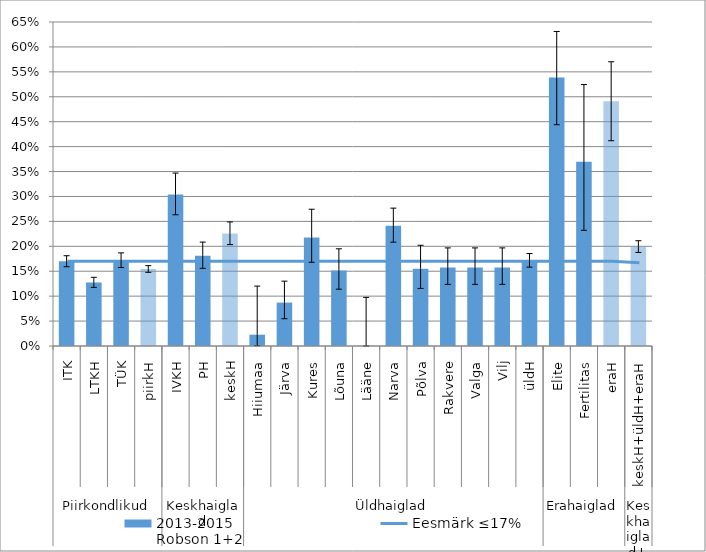
| Category | 2013-2015
Robson 1+2 |
|---|---|
| 0 | 0.17 |
| 1 | 0.127 |
| 2 | 0.172 |
| 3 | 0.154 |
| 4 | 0.304 |
| 5 | 0.181 |
| 6 | 0.226 |
| 7 | 0.023 |
| 8 | 0.087 |
| 9 | 0.218 |
| 10 | 0.151 |
| 11 | 0 |
| 12 | 0.241 |
| 13 | 0.155 |
| 14 | 0.158 |
| 15 | 0.158 |
| 16 | 0.158 |
| 17 | 0.172 |
| 18 | 0.538 |
| 19 | 0.37 |
| 20 | 0.491 |
| 21 | 0.199 |